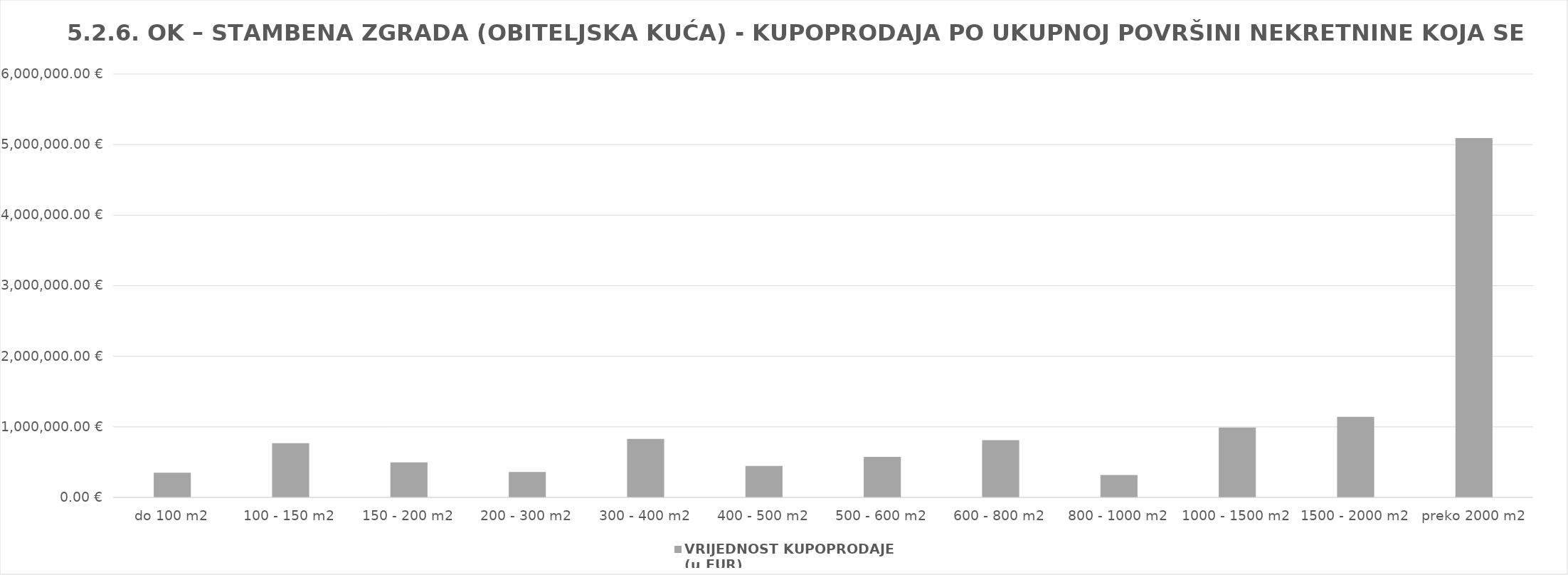
| Category | VRIJEDNOST KUPOPRODAJE   
(u EUR) |
|---|---|
| do 100 m2 | 350416.001 |
| 100 - 150 m2 | 769000 |
| 150 - 200 m2 | 497000 |
| 200 - 300 m2 | 361000 |
| 300 - 400 m2 | 828400 |
| 400 - 500 m2 | 446500 |
| 500 - 600 m2 | 574000 |
| 600 - 800 m2 | 812700 |
| 800 - 1000 m2 | 316827.22 |
| 1000 - 1500 m2 | 990129.999 |
| 1500 - 2000 m2 | 1141756 |
| preko 2000 m2 | 5093255.602 |